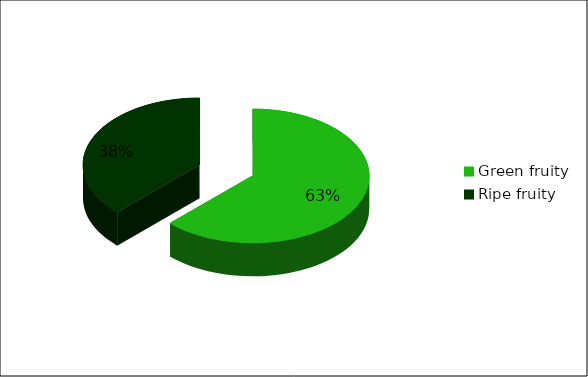
| Category | Number of judge |
|---|---|
| Green fruity | 5 |
| Ripe fruity | 3 |